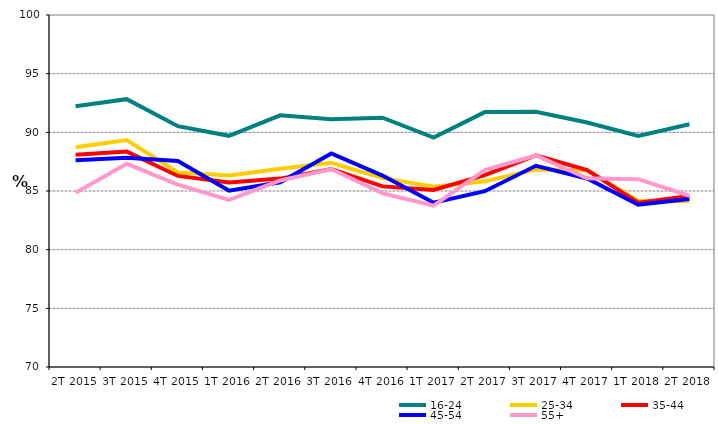
| Category | 16-24 | 25-34 | 35-44 | 45-54 | 55+ |
|---|---|---|---|---|---|
| 2T 2015 | 92.227 | 88.737 | 88.099 | 87.622 | 84.844 |
| 3T 2015 | 92.827 | 89.34 | 88.358 | 87.823 | 87.317 |
| 4T 2015 | 90.522 | 86.591 | 86.284 | 87.56 | 85.536 |
| 1T 2016 | 89.701 | 86.317 | 85.723 | 85.022 | 84.25 |
| 2T 2016 | 91.452 | 86.892 | 86.055 | 85.745 | 85.898 |
| 3T 2016 | 91.111 | 87.406 | 86.877 | 88.205 | 86.875 |
| 4T 2016 | 91.249 | 86.096 | 85.393 | 86.315 | 84.806 |
| 1T 2017 | 89.558 | 85.367 | 85.084 | 84.003 | 83.746 |
| 2T 2017 | 91.725 | 85.824 | 86.347 | 84.981 | 86.783 |
| 3T 2017 | 91.744 | 86.837 | 88.042 | 87.145 | 88.028 |
| 4T 2017 | 90.835 | 86.767 | 86.781 | 86.066 | 86.087 |
| 1T 2018 | 89.69 | 84.159 | 83.996 | 83.835 | 86.004 |
| 2T 2018 | 90.694 | 84.152 | 84.585 | 84.322 | 84.593 |